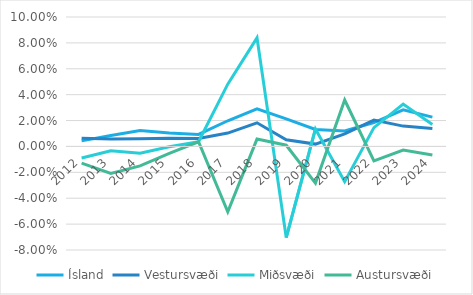
| Category | Ísland | Vestursvæði | Miðsvæði | Austursvæði |
|---|---|---|---|---|
| 2012.0 | 0.004 | 0.006 | -0.009 | -0.013 |
| 2013.0 | 0.008 | 0.006 | -0.003 | -0.021 |
| 2014.0 | 0.012 | 0.006 | -0.005 | -0.015 |
| 2015.0 | 0.01 | 0.006 | 0 | -0.005 |
| 2016.0 | 0.009 | 0.006 | 0.004 | 0.004 |
| 2017.0 | 0.02 | 0.01 | 0.048 | -0.05 |
| 2018.0 | 0.029 | 0.018 | 0.084 | 0.006 |
| 2019.0 | 0.021 | 0.005 | -0.07 | 0.001 |
| 2020.0 | 0.013 | 0.002 | 0.014 | -0.028 |
| 2021.0 | 0.012 | 0.01 | -0.027 | 0.036 |
| 2022.0 | 0.018 | 0.02 | 0.015 | -0.011 |
| 2023.0 | 0.028 | 0.016 | 0.033 | -0.003 |
| 2024.0 | 0.023 | 0.014 | 0.017 | -0.007 |